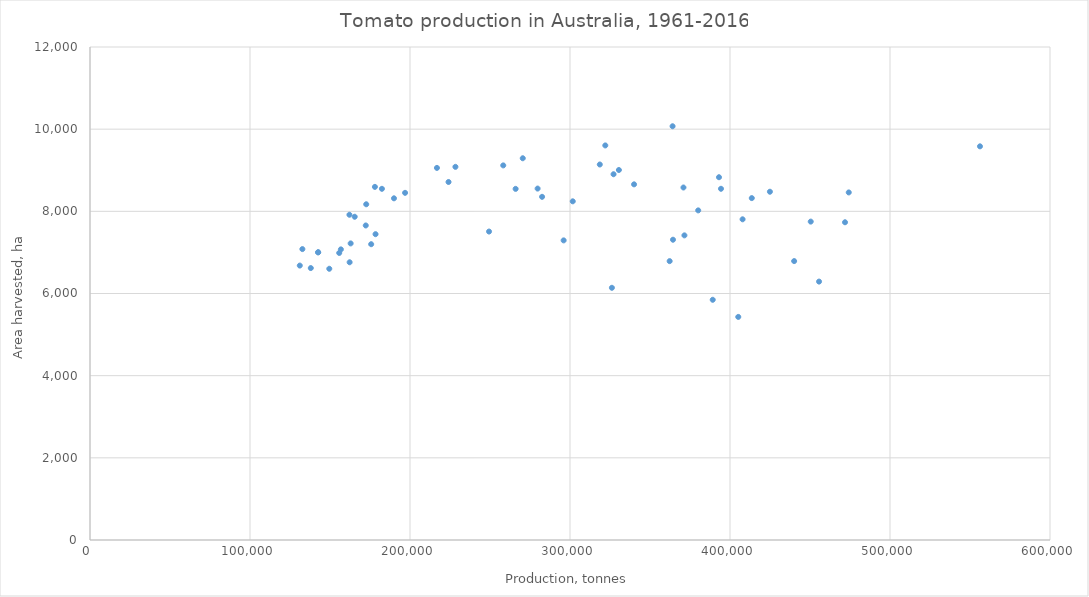
| Category | Series 0 |
|---|---|
| 142591.0 | 7003 |
| 142591.0 | 7003 |
| 131115.0 | 6680 |
| 137995.0 | 6619 |
| 149556.0 | 6602 |
| 162270.0 | 6760 |
| 175741.0 | 7200 |
| 155770.0 | 6987 |
| 156794.0 | 7074 |
| 162912.0 | 7219 |
| 178464.0 | 7444 |
| 189985.0 | 8317 |
| 172353.0 | 7656 |
| 132736.0 | 7081 |
| 165441.0 | 7868 |
| 162151.0 | 7917 |
| 178071.0 | 8595 |
| 182454.0 | 8548 |
| 172639.0 | 8172 |
| 196922.0 | 8450 |
| 216836.0 | 9057 |
| 228390.0 | 9083 |
| 224077.0 | 8714 |
| 258281.0 | 9118 |
| 270475.0 | 9292 |
| 249400.0 | 7508 |
| 266019.0 | 8547 |
| 282551.0 | 8353 |
| 318618.0 | 9140 |
| 322060.0 | 9604 |
| 364108.0 | 10071 |
| 330549.0 | 9006 |
| 279762.0 | 8554 |
| 327221.0 | 8903 |
| 340033.0 | 8657 |
| 370913.0 | 8580 |
| 393117.0 | 8830 |
| 380130.0 | 8023 |
| 394371.0 | 8549 |
| 413617.0 | 8322 |
| 556240.0 | 9582 |
| 424950.0 | 8477 |
| 364368.0 | 7309 |
| 474220.0 | 8460 |
| 407867.0 | 7806 |
| 450459.0 | 7750 |
| 296035.0 | 7293 |
| 362286.0 | 6788 |
| 440093.0 | 6789 |
| 471883.0 | 7734 |
| 301719.0 | 8244 |
| 371514.0 | 7415 |
| 455654.0 | 6290 |
| 326189.0 | 6139 |
| 389205.0 | 5847 |
| 405167.0 | 5430 |